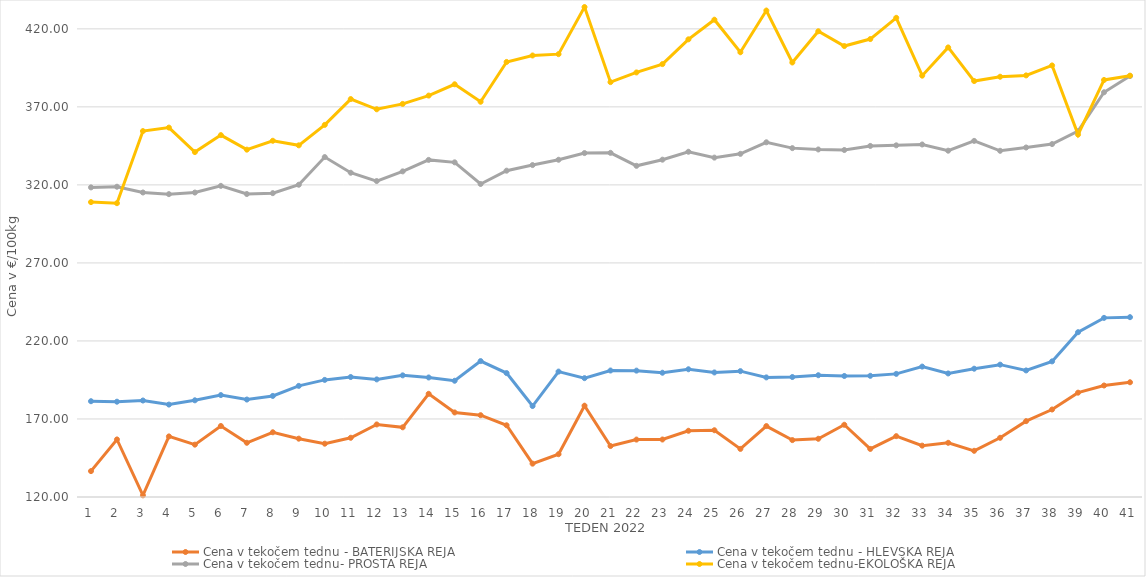
| Category | Cena v tekočem tednu - BATERIJSKA REJA | Cena v tekočem tednu - HLEVSKA REJA | Cena v tekočem tednu- PROSTA REJA | Cena v tekočem tednu-EKOLOŠKA REJA |
|---|---|---|---|---|
| 1.0 | 136.59 | 181.38 | 318.4 | 308.97 |
| 2.0 | 156.88 | 181.07 | 318.82 | 308.28 |
| 3.0 | 121.07 | 181.83 | 315.14 | 354.48 |
| 4.0 | 158.82 | 179.22 | 314.08 | 356.72 |
| 5.0 | 153.55 | 181.96 | 315.1 | 341.03 |
| 6.0 | 165.51 | 185.31 | 319.38 | 351.9 |
| 7.0 | 154.74 | 182.45 | 314.16 | 342.59 |
| 8.0 | 161.48 | 184.77 | 314.71 | 348.28 |
| 9.0 | 157.38 | 191.21 | 320.1 | 345.35 |
| 10.0 | 154.16 | 195.04 | 337.83 | 358.45 |
| 11.0 | 157.96 | 196.88 | 327.79 | 375 |
| 12.0 | 166.49 | 195.36 | 322.46 | 368.45 |
| 13.0 | 164.66 | 197.95 | 328.67 | 371.9 |
| 14.0 | 186.11 | 196.59 | 336.02 | 377.24 |
| 15.0 | 174.18 | 194.49 | 334.46 | 384.48 |
| 16.0 | 172.42 | 207.1 | 320.58 | 373.28 |
| 17.0 | 165.96 | 199.41 | 329.11 | 398.79 |
| 18.0 | 141.36 | 178.29 | 332.71 | 402.93 |
| 19.0 | 147.43 | 200.37 | 336.11 | 403.79 |
| 20.0 | 178.51 | 196.16 | 340.4 | 433.97 |
| 21.0 | 152.67 | 201.05 | 340.55 | 385.86 |
| 22.0 | 156.8 | 200.98 | 332.23 | 392.07 |
| 23.0 | 156.84 | 199.63 | 336.16 | 397.41 |
| 24.0 | 162.44 | 201.86 | 341.24 | 413.28 |
| 25.0 | 162.78 | 199.81 | 337.48 | 425.86 |
| 26.0 | 150.82 | 200.65 | 339.9 | 405 |
| 27.0 | 165.45 | 196.64 | 347.3 | 431.72 |
| 28.0 | 156.46 | 196.88 | 343.56 | 398.45 |
| 29.0 | 157.31 | 198.03 | 342.71 | 418.45 |
| 30.0 | 166.29 | 197.55 | 342.35 | 408.97 |
| 31.0 | 150.81 | 197.66 | 344.97 | 413.45 |
| 32.0 | 158.99 | 198.9 | 345.35 | 427.07 |
| 33.0 | 152.91 | 203.57 | 345.9 | 390 |
| 34.0 | 154.73 | 199.17 | 341.92 | 408.1 |
| 35.0 | 149.6 | 202.21 | 348.2 | 386.55 |
| 36.0 | 157.93 | 204.81 | 341.85 | 389.31 |
| 37.0 | 168.61 | 201.11 | 343.97 | 390.17 |
| 38.0 | 176.07 | 206.91 | 346.16 | 396.55 |
| 39.0 | 186.86 | 225.6 | 354.41 | 352.24 |
| 40.0 | 191.45 | 234.79 | 379.35 | 387.24 |
| 41.0 | 193.52 | 235.24 | 389.75 | 390 |